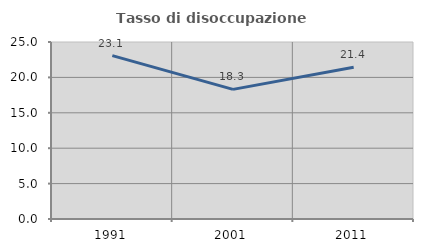
| Category | Tasso di disoccupazione giovanile  |
|---|---|
| 1991.0 | 23.077 |
| 2001.0 | 18.31 |
| 2011.0 | 21.429 |